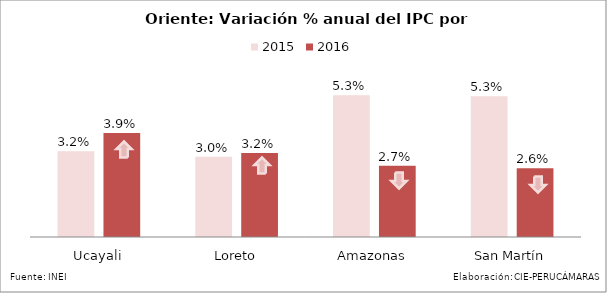
| Category | 2015 | 2016 |
|---|---|---|
| Ucayali | 0.032 | 0.039 |
| Loreto | 0.03 | 0.032 |
| Amazonas | 0.053 | 0.027 |
| San Martín | 0.053 | 0.026 |